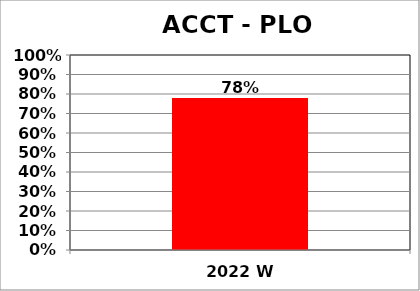
| Category | Series 0 |
|---|---|
| 2022 W | 0.779 |